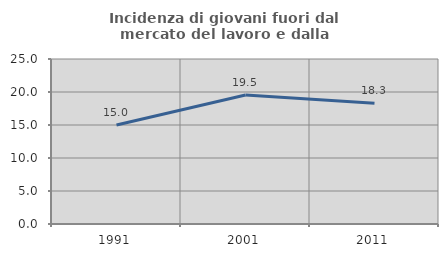
| Category | Incidenza di giovani fuori dal mercato del lavoro e dalla formazione  |
|---|---|
| 1991.0 | 15 |
| 2001.0 | 19.542 |
| 2011.0 | 18.291 |